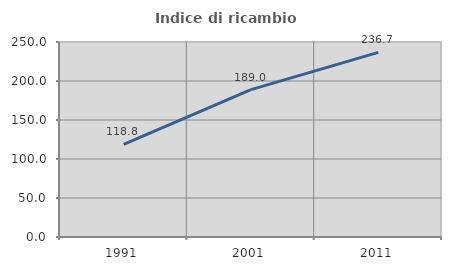
| Category | Indice di ricambio occupazionale  |
|---|---|
| 1991.0 | 118.771 |
| 2001.0 | 188.962 |
| 2011.0 | 236.716 |